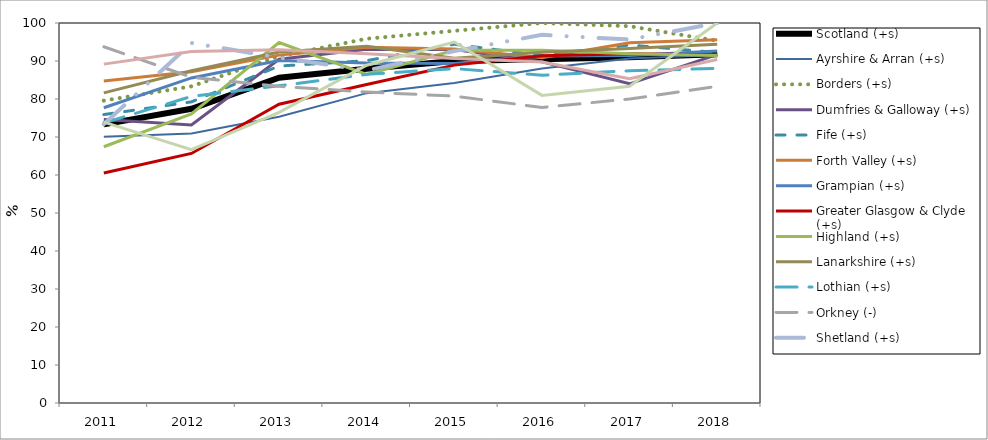
| Category | Scotland (+s) | Ayrshire & Arran (+s) | Borders (+s) | Dumfries & Galloway (+s) | Fife (+s) | Forth Valley (+s) | Grampian (+s) | Greater Glasgow & Clyde (+s) | Highland (+s) | Lanarkshire (+s) | Lothian (+s) | Orkney (-) | Shetland (+s) | Tayside (-s) | Western Isles (+s) |
|---|---|---|---|---|---|---|---|---|---|---|---|---|---|---|---|
| 2011.0 | 73.329 | 70.04 | 79.57 | 74.595 | 75.901 | 84.726 | 77.698 | 60.512 | 67.429 | 81.605 | 73.691 | 93.75 | 73.333 | 89.176 | 73.913 |
| 2012.0 | 77.434 | 70.928 | 83.333 | 73.171 | 79.245 | 87.166 | 85.539 | 65.673 | 76.052 | 87.421 | 80.669 | 85.714 | 94.737 | 92.494 | 66.667 |
| 2013.0 | 85.607 | 75.322 | 91.25 | 90.449 | 88.671 | 91.549 | 90.157 | 78.625 | 94.872 | 92.365 | 83.466 | 83.333 | 90.909 | 92.941 | 76.471 |
| 2014.0 | 87.955 | 81.538 | 95.862 | 93.082 | 90.086 | 93.6 | 89.461 | 83.826 | 86.486 | 93.855 | 86.486 | 81.818 | 87.5 | 91.922 | 88.889 |
| 2015.0 | 90 | 84.211 | 97.945 | 93.023 | 94.407 | 93.137 | 89.316 | 88.918 | 92.81 | 90.751 | 88 | 80.769 | 92.593 | 90.633 | 95 |
| 2016.0 | 90.488 | 88.026 | 100 | 89.781 | 91.416 | 90.863 | 91.304 | 91.36 | 92.857 | 92.275 | 86.263 | 77.778 | 96.875 | 89.749 | 80.952 |
| 2017.0 | 90.988 | 90.677 | 99.16 | 84 | 94.213 | 94.819 | 91.471 | 91.92 | 91.93 | 93.285 | 87.444 | 80 | 95.652 | 85.307 | 83.333 |
| 2018.0 | 91.8 | 91.601 | 95.312 | 91.667 | 92.217 | 95.561 | 92.65 | 91.652 | 91.44 | 94.407 | 88.045 | 83.333 | 100 | 90.391 | 100 |